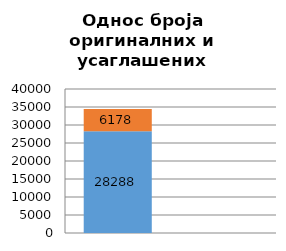
| Category | Учешће оригиналних захтева без усаглашавања | Учешће захтева који су усаглашени |
|---|---|---|
| 0 | 28288 | 6178 |
| 1 | 0.821 | 0.179 |